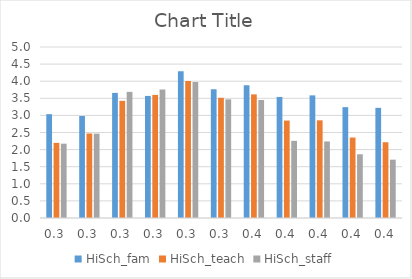
| Category | HiSch_fam | HiSch_teach | HiSch_staff |
|---|---|---|---|
| 0.2916666666666667 | 3.036 | 2.197 | 2.173 |
| 0.3020833333333333 | 2.983 | 2.471 | 2.467 |
| 0.3125 | 3.658 | 3.426 | 3.688 |
| 0.3229166666666667 | 3.569 | 3.599 | 3.758 |
| 0.3333333333333333 | 4.288 | 4.007 | 3.976 |
| 0.34375 | 3.762 | 3.514 | 3.469 |
| 0.3541666666666667 | 3.885 | 3.615 | 3.451 |
| 0.3645833333333333 | 3.54 | 2.849 | 2.256 |
| 0.375 | 3.586 | 2.856 | 2.239 |
| 0.3854166666666667 | 3.241 | 2.353 | 1.863 |
| 0.3958333333333333 | 3.221 | 2.215 | 1.706 |